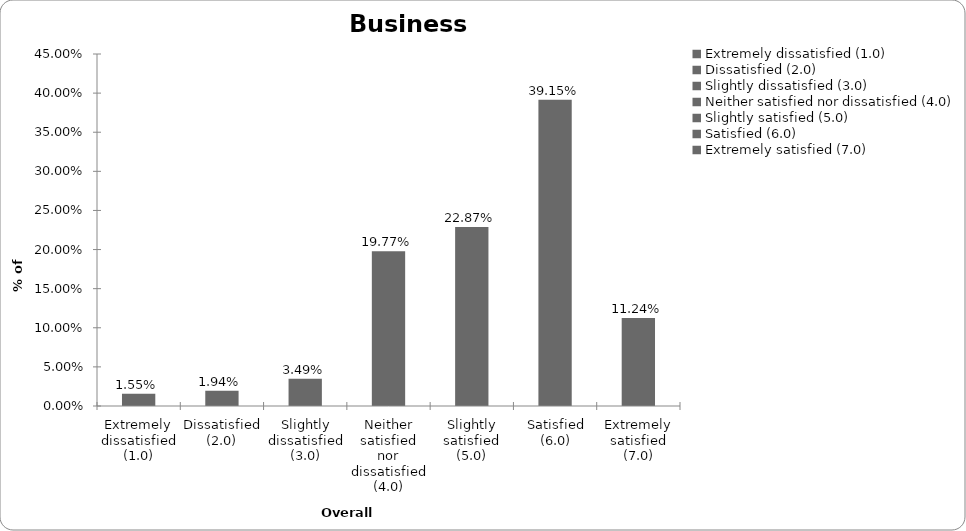
| Category | Business Interruption |
|---|---|
| Extremely dissatisfied (1.0) | 0.016 |
| Dissatisfied (2.0) | 0.019 |
| Slightly dissatisfied (3.0) | 0.035 |
| Neither satisfied nor dissatisfied (4.0) | 0.198 |
| Slightly satisfied (5.0) | 0.229 |
| Satisfied (6.0) | 0.391 |
| Extremely satisfied (7.0) | 0.112 |